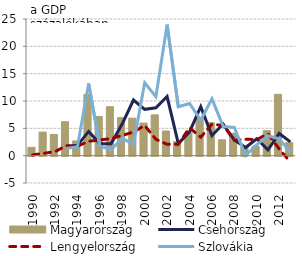
| Category | Magyarország |
|---|---|
| 1990.0 | 1.517 |
| 1991.0 | 4.311 |
| 1992.0 | 3.886 |
| 1993.0 | 6.204 |
| 1994.0 | 2.7 |
| 1995.0 | 11.198 |
| 1996.0 | 7.184 |
| 1997.0 | 8.956 |
| 1998.0 | 6.955 |
| 1999.0 | 6.863 |
| 2000.0 | 5.959 |
| 2001.0 | 7.466 |
| 2002.0 | 4.51 |
| 2003.0 | 2.559 |
| 2004.0 | 4.185 |
| 2005.0 | 6.988 |
| 2006.0 | 6.058 |
| 2007.0 | 2.903 |
| 2008.0 | 4.102 |
| 2009.0 | 1.575 |
| 2010.0 | 1.727 |
| 2011.0 | 4.576 |
| 2012.0 | 11.223 |
| 2013.0 | 2.382 |